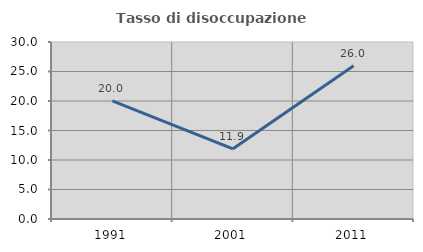
| Category | Tasso di disoccupazione giovanile  |
|---|---|
| 1991.0 | 20.029 |
| 2001.0 | 11.89 |
| 2011.0 | 25.984 |